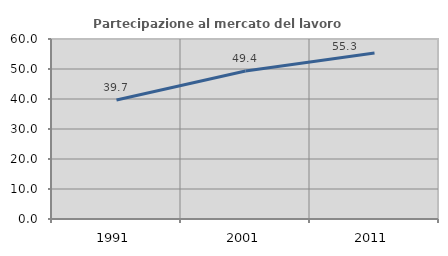
| Category | Partecipazione al mercato del lavoro  femminile |
|---|---|
| 1991.0 | 39.661 |
| 2001.0 | 49.362 |
| 2011.0 | 55.305 |